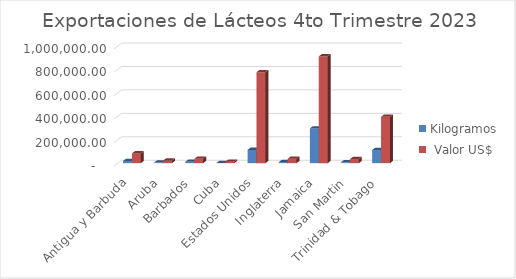
| Category | Kilogramos |  Valor US$ |
|---|---|---|
| Antigua y Barbuda | 18187.92 | 83192.05 |
| Aruba | 5428.62 | 21521.3 |
| Barbados | 12079.78 | 36512.15 |
| Cuba | 1172.65 | 12043 |
| Estados Unidos | 113032.27 | 775490.8 |
| Inglaterra | 8648.5 | 37817.9 |
| Jamaica | 296070.15 | 910653.76 |
| San Martin | 7468.34 | 34190.1 |
| Trinidad & Tobago | 111826.12 | 395538 |